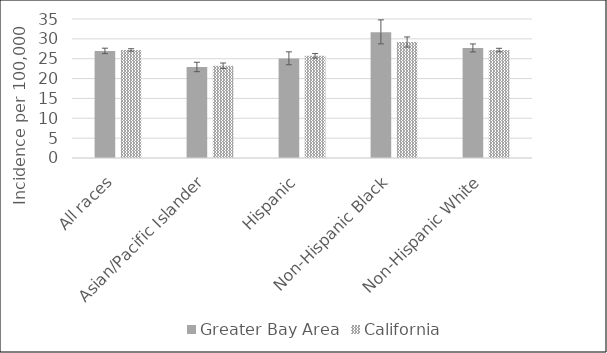
| Category | Greater Bay Area | California | SEER 18 |
|---|---|---|---|
| All races | 26.96 | 27.22 |  |
| Asian/Pacific Islander | 22.9 | 23.23 |  |
| Hispanic | 25.07 | 25.72 |  |
| Non-Hispanic Black | 31.64 | 29.18 |  |
| Non-Hispanic White | 27.7 | 27.18 |  |